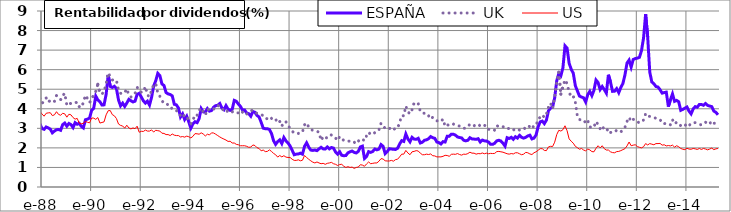
| Category | ESPAÑA | UK | US |
|---|---|---|---|
| 1987-03-31 | 2.96 | 3.62 | 3.08 |
| 1987-04-30 | 3.05 | 3.47 | 3.16 |
| 1987-05-29 | 3.05 | 3.25 | 3.16 |
| 1987-06-30 | 2.83 | 3.15 | 3.04 |
| 1987-07-31 | 2.53 | 3.06 | 2.94 |
| 1987-08-31 | 2.37 | 3.22 | 2.84 |
| 1987-09-30 | 2.37 | 3.13 | 2.91 |
| 1987-10-30 | 3.39 | 4.26 | 3.72 |
| 1987-11-30 | 3.43 | 4.83 | 4.1 |
| 1987-12-31 | 3.22 | 4.49 | 3.87 |
| 1988-01-29 | 2.99 | 4.29 | 3.73 |
| 1988-02-29 | 2.95 | 4.37 | 3.62 |
| 1988-03-31 | 3.07 | 4.55 | 3.77 |
| 1988-04-29 | 3.02 | 4.34 | 3.79 |
| 1988-05-31 | 2.96 | 4.43 | 3.8 |
| 1988-06-30 | 2.77 | 4.35 | 3.65 |
| 1988-07-29 | 2.86 | 4.38 | 3.69 |
| 1988-08-31 | 2.93 | 4.68 | 3.85 |
| 1988-09-30 | 2.94 | 4.59 | 3.71 |
| 1988-10-31 | 2.9 | 4.47 | 3.67 |
| 1988-11-30 | 3.19 | 4.68 | 3.77 |
| 1988-12-30 | 3.27 | 4.79 | 3.74 |
| 1989-01-31 | 3.11 | 4.19 | 3.57 |
| 1989-02-28 | 3.25 | 4.3 | 3.72 |
| 1989-03-31 | 3.19 | 4.26 | 3.69 |
| 1989-04-28 | 3.04 | 4.25 | 3.55 |
| 1989-05-31 | 3.29 | 4.3 | 3.47 |
| 1989-06-30 | 3.21 | 4.34 | 3.51 |
| 1989-07-31 | 3.26 | 4.11 | 3.26 |
| 1989-08-31 | 3.1 | 4.07 | 3.23 |
| 1989-09-29 | 3.02 | 4.32 | 3.26 |
| 1989-10-31 | 3.44 | 4.69 | 3.35 |
| 1989-11-30 | 3.47 | 4.52 | 3.31 |
| 1989-12-29 | 3.53 | 4.32 | 3.28 |
| 1990-01-31 | 3.92 | 4.48 | 3.53 |
| 1990-02-28 | 4.03 | 4.73 | 3.52 |
| 1990-03-30 | 4.65 | 4.89 | 3.46 |
| 1990-04-30 | 4.45 | 5.25 | 3.55 |
| 1990-05-31 | 4.36 | 4.8 | 3.27 |
| 1990-06-29 | 4.19 | 4.76 | 3.3 |
| 1990-07-31 | 4.2 | 4.87 | 3.33 |
| 1990-08-31 | 4.73 | 5.29 | 3.69 |
| 1990-09-28 | 5.73 | 5.84 | 3.9 |
| 1990-10-31 | 5.14 | 5.65 | 3.91 |
| 1990-11-30 | 5.09 | 5.47 | 3.7 |
| 1990-12-31 | 5.15 | 5.5 | 3.64 |
| 1991-01-31 | 5.03 | 5.45 | 3.5 |
| 1991-02-28 | 4.45 | 4.95 | 3.22 |
| 1991-03-29 | 4.15 | 4.79 | 3.15 |
| 1991-04-30 | 4.29 | 4.77 | 3.12 |
| 1991-05-31 | 4.12 | 4.83 | 3.01 |
| 1991-06-28 | 4.29 | 5.02 | 3.16 |
| 1991-07-31 | 4.48 | 4.71 | 3.02 |
| 1991-08-30 | 4.41 | 4.6 | 2.97 |
| 1991-09-30 | 4.35 | 4.67 | 3.02 |
| 1991-10-31 | 4.39 | 4.78 | 2.98 |
| 1991-11-29 | 4.74 | 5.09 | 3.11 |
| 1991-12-31 | 4.79 | 5.02 | 2.8 |
| 1992-01-31 | 4.61 | 4.84 | 2.85 |
| 1992-02-28 | 4.41 | 4.86 | 2.84 |
| 1992-03-31 | 4.29 | 5.14 | 2.91 |
| 1992-04-30 | 4.39 | 4.7 | 2.86 |
| 1992-05-29 | 4.19 | 4.62 | 2.86 |
| 1992-06-30 | 4.59 | 4.95 | 2.92 |
| 1992-07-31 | 5.16 | 5.23 | 2.81 |
| 1992-08-31 | 5.43 | 5.29 | 2.9 |
| 1992-09-30 | 5.81 | 4.8 | 2.88 |
| 1992-10-30 | 5.7 | 4.64 | 2.86 |
| 1992-11-30 | 5.27 | 4.42 | 2.75 |
| 1992-12-31 | 5.19 | 4.27 | 2.74 |
| 1993-01-29 | 4.83 | 4.27 | 2.68 |
| 1993-02-26 | 4.76 | 4.2 | 2.68 |
| 1993-03-31 | 4.73 | 4.17 | 2.63 |
| 1993-04-30 | 4.66 | 3.97 | 2.71 |
| 1993-05-31 | 4.23 | 3.96 | 2.65 |
| 1993-06-30 | 4.2 | 3.9 | 2.63 |
| 1993-07-30 | 4.04 | 3.86 | 2.63 |
| 1993-08-31 | 3.58 | 3.64 | 2.56 |
| 1993-09-30 | 3.74 | 3.75 | 2.58 |
| 1993-10-29 | 3.45 | 3.59 | 2.55 |
| 1993-11-30 | 3.62 | 3.62 | 2.6 |
| 1993-12-31 | 3.33 | 3.35 | 2.57 |
| 1994-01-31 | 3.01 | 3.25 | 2.51 |
| 1994-02-28 | 3.23 | 3.41 | 2.59 |
| 1994-03-31 | 3.34 | 3.7 | 2.73 |
| 1994-04-29 | 3.29 | 3.67 | 2.72 |
| 1994-05-31 | 3.5 | 3.92 | 2.7 |
| 1994-06-30 | 4.01 | 4.04 | 2.77 |
| 1994-07-29 | 3.84 | 3.82 | 2.71 |
| 1994-08-31 | 3.83 | 3.68 | 2.61 |
| 1994-09-30 | 4.01 | 3.99 | 2.7 |
| 1994-10-31 | 3.88 | 3.92 | 2.66 |
| 1994-11-30 | 3.91 | 3.96 | 2.77 |
| 1994-12-30 | 4.08 | 3.98 | 2.76 |
| 1995-01-31 | 4.16 | 4.11 | 2.7 |
| 1995-02-28 | 4.18 | 4.18 | 2.63 |
| 1995-03-31 | 4.27 | 4.1 | 2.56 |
| 1995-04-28 | 4.04 | 4.01 | 2.5 |
| 1995-05-31 | 3.95 | 3.91 | 2.45 |
| 1995-06-30 | 4.16 | 3.97 | 2.4 |
| 1995-07-31 | 3.98 | 3.81 | 2.33 |
| 1995-08-31 | 3.92 | 3.85 | 2.34 |
| 1995-09-29 | 3.97 | 3.84 | 2.25 |
| 1995-10-31 | 4.43 | 3.86 | 2.25 |
| 1995-11-30 | 4.38 | 3.79 | 2.18 |
| 1995-12-29 | 4.24 | 3.79 | 2.16 |
| 1996-01-31 | 4.12 | 3.71 | 2.11 |
| 1996-02-29 | 3.93 | 3.83 | 2.11 |
| 1996-03-29 | 3.94 | 3.87 | 2.11 |
| 1996-04-30 | 3.78 | 3.73 | 2.08 |
| 1996-05-31 | 3.75 | 3.83 | 2.03 |
| 1996-06-28 | 3.62 | 3.9 | 2.04 |
| 1996-07-31 | 3.86 | 3.93 | 2.15 |
| 1996-08-30 | 3.82 | 3.81 | 2.12 |
| 1996-09-30 | 3.66 | 3.77 | 2.01 |
| 1996-10-31 | 3.58 | 3.73 | 1.97 |
| 1996-11-29 | 3.31 | 3.7 | 1.85 |
| 1996-12-31 | 3.01 | 3.65 | 1.89 |
| 1997-01-31 | 2.98 | 3.51 | 1.81 |
| 1997-02-28 | 2.98 | 3.49 | 1.82 |
| 1997-03-31 | 2.94 | 3.59 | 1.9 |
| 1997-04-30 | 2.74 | 3.51 | 1.82 |
| 1997-05-30 | 2.37 | 3.42 | 1.72 |
| 1997-06-30 | 2.18 | 3.47 | 1.65 |
| 1997-07-31 | 2.32 | 3.27 | 1.53 |
| 1997-08-29 | 2.41 | 3.35 | 1.61 |
| 1997-09-30 | 2.22 | 3.11 | 1.54 |
| 1997-10-31 | 2.53 | 3.33 | 1.6 |
| 1997-11-28 | 2.36 | 3.33 | 1.53 |
| 1997-12-31 | 2.25 | 3.15 | 1.51 |
| 1998-01-30 | 2.1 | 3 | 1.51 |
| 1998-02-27 | 1.88 | 2.86 | 1.42 |
| 1998-03-31 | 1.65 | 2.75 | 1.36 |
| 1998-04-30 | 1.68 | 2.74 | 1.36 |
| 1998-05-29 | 1.69 | 2.74 | 1.39 |
| 1998-06-30 | 1.73 | 2.79 | 1.34 |
| 1998-07-31 | 1.68 | 2.81 | 1.37 |
| 1998-08-31 | 2.08 | 3.18 | 1.61 |
| 1998-09-30 | 2.26 | 3.28 | 1.51 |
| 1998-10-30 | 2.04 | 3.07 | 1.42 |
| 1998-11-30 | 1.89 | 2.94 | 1.34 |
| 1998-12-31 | 1.87 | 2.9 | 1.27 |
| 1999-01-29 | 1.89 | 2.88 | 1.23 |
| 1999-02-26 | 1.86 | 2.85 | 1.28 |
| 1999-03-31 | 1.95 | 2.8 | 1.23 |
| 1999-04-30 | 2.03 | 2.38 | 1.19 |
| 1999-05-31 | 1.95 | 2.57 | 1.21 |
| 1999-06-30 | 1.94 | 2.48 | 1.16 |
| 1999-07-30 | 2.05 | 2.54 | 1.21 |
| 1999-08-31 | 1.95 | 2.54 | 1.23 |
| 1999-09-30 | 2.02 | 2.67 | 1.26 |
| 1999-10-29 | 1.99 | 2.58 | 1.19 |
| 1999-11-30 | 1.79 | 2.5 | 1.16 |
| 1999-12-31 | 1.68 | 2.38 | 1.1 |
| 2000-01-31 | 1.8 | 2.58 | 1.15 |
| 2000-02-29 | 1.62 | 2.47 | 1.16 |
| 2000-03-31 | 1.6 | 2.38 | 1.06 |
| 2000-04-28 | 1.61 | 2.34 | 1 |
| 2000-05-31 | 1.75 | 2.35 | 1.04 |
| 2000-06-30 | 1.8 | 2.34 | 1 |
| 2000-07-31 | 1.84 | 2.32 | 1.02 |
| 2000-08-31 | 1.77 | 2.26 | 0.95 |
| 2000-09-29 | 1.74 | 2.41 | 1 |
| 2000-10-31 | 1.82 | 2.34 | 1.02 |
| 2000-11-30 | 2.05 | 2.46 | 1.14 |
| 2000-12-29 | 2.09 | 2.44 | 1.12 |
| 2001-01-31 | 1.46 | 2.37 | 1.06 |
| 2001-02-28 | 1.56 | 2.62 | 1.18 |
| 2001-03-30 | 1.81 | 2.8 | 1.28 |
| 2001-04-30 | 1.77 | 2.68 | 1.19 |
| 2001-05-31 | 1.82 | 2.7 | 1.21 |
| 2001-06-29 | 1.94 | 2.78 | 1.23 |
| 2001-07-31 | 1.9 | 2.8 | 1.23 |
| 2001-08-31 | 1.94 | 2.93 | 1.32 |
| 2001-09-28 | 2.17 | 3.26 | 1.45 |
| 2001-10-31 | 2.08 | 3.16 | 1.43 |
| 2001-11-30 | 1.71 | 2.98 | 1.34 |
| 2001-12-31 | 1.81 | 2.97 | 1.33 |
| 2002-01-31 | 1.96 | 2.98 | 1.33 |
| 2002-02-28 | 1.94 | 3.05 | 1.36 |
| 2002-03-29 | 1.93 | 2.94 | 1.32 |
| 2002-04-30 | 1.92 | 3 | 1.4 |
| 2002-05-31 | 1.98 | 3.01 | 1.42 |
| 2002-06-28 | 2.2 | 3.3 | 1.54 |
| 2002-07-31 | 2.37 | 3.65 | 1.68 |
| 2002-08-30 | 2.33 | 3.64 | 1.68 |
| 2002-09-30 | 2.71 | 4.14 | 1.87 |
| 2002-10-31 | 2.46 | 3.84 | 1.74 |
| 2002-11-29 | 2.31 | 3.74 | 1.65 |
| 2002-12-31 | 2.54 | 3.95 | 1.8 |
| 2003-01-31 | 2.45 | 4.3 | 1.82 |
| 2003-02-28 | 2.44 | 4.23 | 1.86 |
| 2003-03-31 | 2.49 | 4.26 | 1.84 |
| 2003-04-30 | 2.25 | 3.87 | 1.73 |
| 2003-05-30 | 2.29 | 3.78 | 1.65 |
| 2003-06-30 | 2.39 | 3.77 | 1.65 |
| 2003-07-31 | 2.41 | 3.63 | 1.68 |
| 2003-08-29 | 2.47 | 3.63 | 1.66 |
| 2003-09-30 | 2.58 | 3.71 | 1.69 |
| 2003-10-31 | 2.52 | 3.53 | 1.6 |
| 2003-11-28 | 2.49 | 3.5 | 1.59 |
| 2003-12-31 | 2.3 | 3.38 | 1.54 |
| 2004-01-30 | 2.27 | 3.41 | 1.54 |
| 2004-02-27 | 2.2 | 3.36 | 1.54 |
| 2004-03-31 | 2.32 | 3.47 | 1.57 |
| 2004-04-30 | 2.3 | 3.1 | 1.62 |
| 2004-05-31 | 2.59 | 3.18 | 1.61 |
| 2004-06-30 | 2.59 | 3.16 | 1.57 |
| 2004-07-30 | 2.7 | 3.23 | 1.67 |
| 2004-08-31 | 2.7 | 3.22 | 1.68 |
| 2004-09-30 | 2.65 | 3.15 | 1.67 |
| 2004-10-29 | 2.56 | 3.13 | 1.71 |
| 2004-11-30 | 2.53 | 3.12 | 1.66 |
| 2004-12-31 | 2.51 | 3.03 | 1.63 |
| 2005-01-31 | 2.39 | 3 | 1.68 |
| 2005-02-28 | 2.36 | 3.01 | 1.67 |
| 2005-03-31 | 2.39 | 3.09 | 1.71 |
| 2005-04-29 | 2.52 | 3.21 | 1.78 |
| 2005-05-31 | 2.46 | 3.21 | 1.73 |
| 2005-06-30 | 2.45 | 3.13 | 1.73 |
| 2005-07-29 | 2.44 | 3.2 | 1.68 |
| 2005-08-31 | 2.47 | 3.21 | 1.71 |
| 2005-09-30 | 2.3 | 3.12 | 1.7 |
| 2005-10-31 | 2.4 | 3.19 | 1.74 |
| 2005-11-30 | 2.36 | 3.15 | 1.7 |
| 2005-12-30 | 2.35 | 3.13 | 1.73 |
| 2006-01-31 | 2.3 | 2.95 | 1.7 |
| 2006-02-28 | 2.18 | 2.94 | 1.72 |
| 2006-03-31 | 2.18 | 2.96 | 1.71 |
| 2006-04-28 | 2.24 | 2.9 | 1.72 |
| 2006-05-31 | 2.36 | 3.13 | 1.81 |
| 2006-06-30 | 2.39 | 3.1 | 1.82 |
| 2006-07-31 | 2.35 | 3.05 | 1.8 |
| 2006-08-31 | 2.24 | 3.08 | 1.78 |
| 2006-09-29 | 2.09 | 3.06 | 1.74 |
| 2006-10-31 | 2.52 | 2.97 | 1.7 |
| 2006-11-30 | 2.48 | 3 | 1.68 |
| 2006-12-29 | 2.54 | 2.91 | 1.71 |
| 2007-01-31 | 2.44 | 2.91 | 1.69 |
| 2007-02-28 | 2.57 | 2.98 | 1.75 |
| 2007-03-30 | 2.5 | 2.96 | 1.75 |
| 2007-04-30 | 2.64 | 2.91 | 1.7 |
| 2007-05-31 | 2.54 | 2.9 | 1.65 |
| 2007-06-29 | 2.5 | 2.94 | 1.68 |
| 2007-07-31 | 2.54 | 3.06 | 1.77 |
| 2007-08-31 | 2.61 | 3.14 | 1.75 |
| 2007-09-28 | 2.65 | 3.08 | 1.69 |
| 2007-10-31 | 2.46 | 2.97 | 1.66 |
| 2007-11-30 | 2.5 | 3.15 | 1.75 |
| 2007-12-31 | 2.66 | 3.16 | 1.8 |
| 2008-01-31 | 3.08 | 3.46 | 1.88 |
| 2008-02-29 | 3.33 | 3.57 | 1.96 |
| 2008-03-31 | 3.37 | 3.69 | 1.96 |
| 2008-04-30 | 3.24 | 3.56 | 1.87 |
| 2008-05-30 | 3.42 | 3.72 | 1.86 |
| 2008-06-30 | 3.9 | 4.08 | 2.05 |
| 2008-07-31 | 4.03 | 4.29 | 2.08 |
| 2008-08-29 | 4.09 | 4.01 | 2.07 |
| 2008-09-30 | 4.56 | 4.63 | 2.29 |
| 2008-10-31 | 5.43 | 5.35 | 2.68 |
| 2008-11-28 | 5.8 | 5.87 | 2.9 |
| 2008-12-31 | 5.69 | 4.75 | 2.86 |
| 2009-01-30 | 6.1 | 5.13 | 2.93 |
| 2009-02-27 | 7.22 | 5.48 | 3.13 |
| 2009-03-31 | 7.1 | 5.29 | 2.88 |
| 2009-04-30 | 6.33 | 4.85 | 2.46 |
| 2009-05-29 | 6.02 | 4.6 | 2.34 |
| 2009-06-30 | 5.82 | 4.64 | 2.24 |
| 2009-07-31 | 5.18 | 4.34 | 2.08 |
| 2009-08-31 | 4.91 | 3.6 | 2.01 |
| 2009-09-30 | 4.65 | 3.45 | 1.93 |
| 2009-10-30 | 4.6 | 3.42 | 1.97 |
| 2009-11-30 | 4.56 | 3.43 | 1.89 |
| 2009-12-31 | 4.35 | 3.28 | 1.85 |
| 2010-01-29 | 4.72 | 3.41 | 1.94 |
| 2010-02-26 | 4.89 | 3.08 | 1.9 |
| 2010-03-31 | 4.67 | 3.02 | 1.81 |
| 2010-04-30 | 4.94 | 3.07 | 1.8 |
| 2010-05-31 | 5.47 | 3.35 | 1.98 |
| 2010-06-30 | 5.34 | 3.19 | 2.11 |
| 2010-07-30 | 4.98 | 2.98 | 2 |
| 2010-08-31 | 5.14 | 3.13 | 2.11 |
| 2010-09-30 | 4.98 | 2.92 | 1.96 |
| 2010-10-29 | 4.8 | 2.87 | 1.89 |
| 2010-11-30 | 5.74 | 2.98 | 1.89 |
| 2010-12-31 | 5.37 | 2.79 | 1.8 |
| 2011-01-31 | 4.89 | 2.8 | 1.76 |
| 2011-02-28 | 4.9 | 2.8 | 1.75 |
| 2011-03-31 | 5.03 | 2.91 | 1.81 |
| 2011-04-29 | 4.82 | 2.88 | 1.82 |
| 2011-05-31 | 5.09 | 2.82 | 1.86 |
| 2011-06-30 | 5.29 | 2.92 | 1.91 |
| 2011-07-29 | 5.73 | 3.05 | 1.96 |
| 2011-08-31 | 6.34 | 3.35 | 2.1 |
| 2011-09-30 | 6.49 | 3.56 | 2.3 |
| 2011-10-31 | 6.13 | 3.35 | 2.11 |
| 2011-11-30 | 6.52 | 3.46 | 2.14 |
| 2011-12-30 | 6.57 | 3.44 | 2.16 |
| 2012-01-31 | 6.59 | 3.33 | 2.07 |
| 2012-02-29 | 6.63 | 3.28 | 2.03 |
| 2012-03-30 | 6.97 | 3.39 | 2 |
| 2012-04-30 | 7.62 | 3.42 | 2.06 |
| 2012-05-31 | 8.84 | 3.75 | 2.22 |
| 2012-06-29 | 7.67 | 3.62 | 2.15 |
| 2012-07-31 | 5.88 | 3.61 | 2.22 |
| 2012-08-31 | 5.37 | 3.57 | 2.19 |
| 2012-09-28 | 5.28 | 3.54 | 2.16 |
| 2012-10-31 | 5.14 | 3.52 | 2.22 |
| 2012-11-30 | 5.11 | 3.48 | 2.22 |
| 2012-12-31 | 4.97 | 3.45 | 2.23 |
| 2013-01-31 | 4.8 | 3.25 | 2.14 |
| 2013-02-28 | 4.83 | 3.24 | 2.16 |
| 2013-03-29 | 4.85 | 3.25 | 2.1 |
| 2013-04-30 | 4.11 | 3.25 | 2.12 |
| 2013-05-31 | 4.46 | 3.18 | 2.1 |
| 2013-06-28 | 4.76 | 3.44 | 2.14 |
| 2013-07-31 | 4.38 | 3.23 | 2.04 |
| 2013-08-30 | 4.43 | 3.31 | 2.11 |
| 2013-09-30 | 4.36 | 3.28 | 2.06 |
| 2013-10-31 | 3.92 | 3.13 | 1.97 |
| 2013-11-29 | 3.97 | 3.2 | 1.93 |
| 2013-12-31 | 4.03 | 3.14 | 1.91 |
| 2014-01-31 | 4.09 | 3.23 | 1.98 |
| 2014-02-28 | 3.88 | 3.13 | 1.94 |
| 2014-03-31 | 3.74 | 3.26 | 1.93 |
| 2014-04-30 | 3.99 | 3.29 | 1.97 |
| 2014-05-30 | 4.11 | 3.29 | 1.95 |
| 2014-06-30 | 4.08 | 3.24 | 1.92 |
| 2014-07-31 | 4.22 | 3.2 | 1.97 |
| 2014-08-29 | 4.22 | 3.18 | 1.92 |
| 2014-09-30 | 4.18 | 3.29 | 1.97 |
| 2014-10-31 | 4.27 | 3.31 | 1.94 |
| 2014-11-28 | 4.17 | 3.25 | 1.9 |
| 2014-12-31 | 4.14 | 3.33 | 1.94 |
| 2015-01-30 | 4.11 | 3.16 | 1.99 |
| 2015-02-27 | 3.88 | 3.26 | 1.91 |
| 2015-03-31 | 3.82 | 3.26 | 1.95 |
| 2015-04-30 | 3.69 | 3.2 | 1.97 |